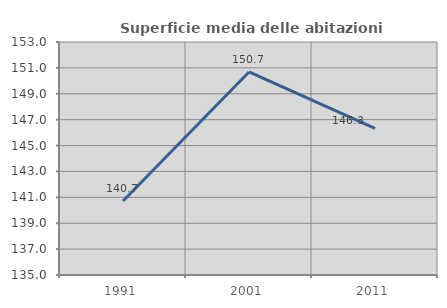
| Category | Superficie media delle abitazioni occupate |
|---|---|
| 1991.0 | 140.718 |
| 2001.0 | 150.688 |
| 2011.0 | 146.335 |